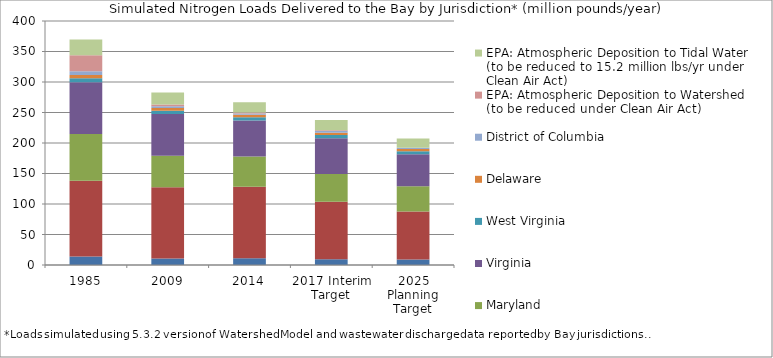
| Category | New York  | Pennsylvania  | Maryland  | Virginia  | West Virginia  | Delaware  | District of Columbia  | EPA: Atmospheric Deposition to Watershed (to be reduced under Clean Air Act) | EPA: Atmospheric Deposition to Tidal Water (to be reduced to 15.2 million lbs/yr under Clean Air Act) |
|---|---|---|---|---|---|---|---|---|---|
| 1985 | 13.914 | 124.277 | 76.561 | 85.028 | 6.367 | 5.267 | 6.171 | 26.117 | 26.08 |
| 2009 | 10.719 | 116.636 | 51.948 | 68.128 | 5.465 | 4.474 | 2.877 | 3.047 | 19.368 |
| 2014 | 11.235 | 117.014 | 49.815 | 59.024 | 5.273 | 4.048 | 2.071 | 1.628 | 16.726 |
| 2017 Interim Target | 9.598 | 94.052 | 45.481 | 58.804 | 5.2 | 3.824 | 2.575 | 1.219 | 16.855 |
| 2025 Planning Target | 8.85 | 78.996 | 41.17 | 52.588 | 5.023 | 3.391 | 2.373 | 0 | 15.18 |